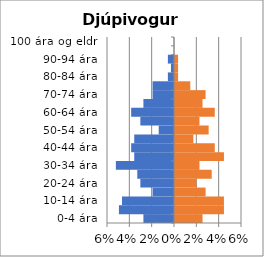
| Category | % karlar | %konur |
|---|---|---|
| 0-4 ára | -0.027 | 0.025 |
| 5-9 ára | -0.049 | 0.044 |
| 10-14 ára | -0.047 | 0.044 |
| 15-19 ára | -0.019 | 0.027 |
| 20-24 ára | -0.03 | 0.019 |
| 25-29 ára | -0.033 | 0.033 |
| 30-34 ára | -0.052 | 0.022 |
| 35-39 ára | -0.036 | 0.044 |
| 40-44 ára | -0.038 | 0.036 |
| 45-49 ára | -0.036 | 0.016 |
| 50-54 ára | -0.014 | 0.03 |
| 55-59 ára | -0.03 | 0.022 |
| 60-64 ára | -0.038 | 0.036 |
| 65-69 ára | -0.027 | 0.025 |
| 70-74 ára | -0.019 | 0.027 |
| 75-79 ára | -0.019 | 0.014 |
| 80-84 ára | -0.005 | 0.003 |
| 85-89 ára | -0.003 | 0.003 |
| 90-94 ára | -0.005 | 0.003 |
| 95-99 ára | 0 | 0 |
| 100 ára og eldri | 0 | 0 |